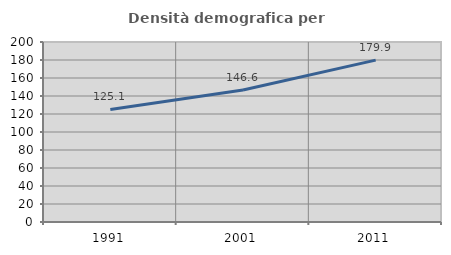
| Category | Densità demografica |
|---|---|
| 1991.0 | 125.088 |
| 2001.0 | 146.609 |
| 2011.0 | 179.898 |